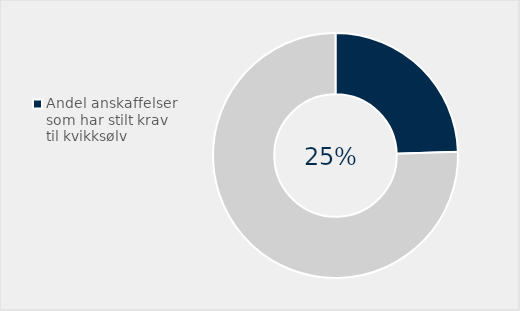
| Category | Series 0 |
|---|---|
| Andel anskaffelser som har stilt krav til kvikksølv | 0.245 |
| Ikke stilt krav | 0.755 |